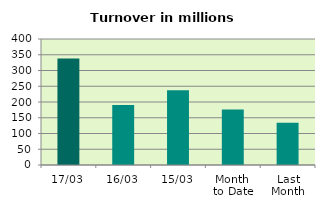
| Category | Series 0 |
|---|---|
| 17/03 | 338.24 |
| 16/03 | 190.587 |
| 15/03 | 237.08 |
| Month 
to Date | 176.58 |
| Last
Month | 133.846 |